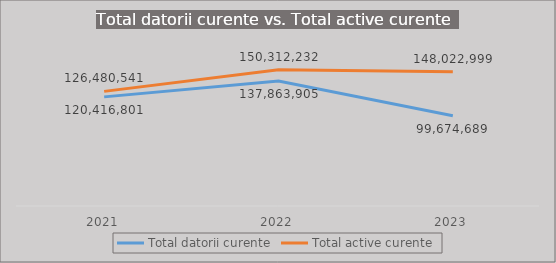
| Category | Total datorii curente | Total active curente |
|---|---|---|
| 2021.0 | 120416800.563 | 126480540.967 |
| 2022.0 | 137863905.482 | 150312232.415 |
| 2023.0 | 99674689 | 148022999 |